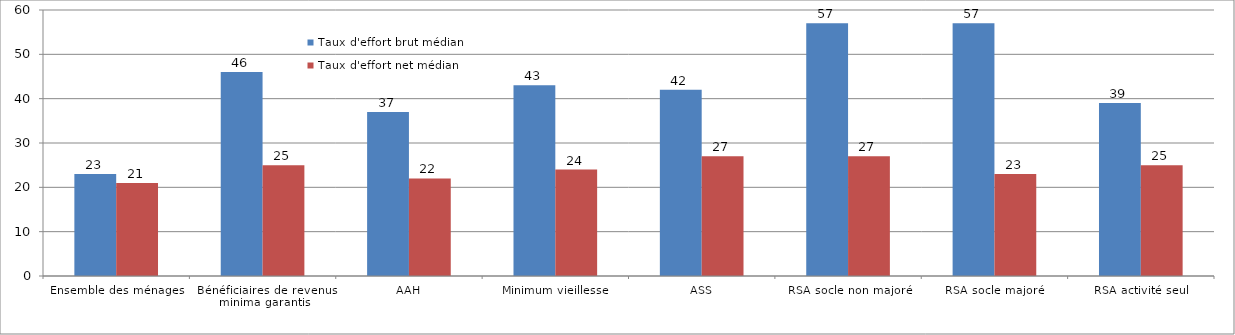
| Category | Taux d'effort brut médian | Taux d'effort net médian |
|---|---|---|
| Ensemble des ménages | 23 | 21 |
| Bénéficiaires de revenus minima garantis | 46 | 25 |
| AAH | 37 | 22 |
| Minimum vieillesse | 43 | 24 |
| ASS | 42 | 27 |
| RSA socle non majoré | 57 | 27 |
| RSA socle majoré | 57 | 23 |
| RSA activité seul | 39 | 25 |